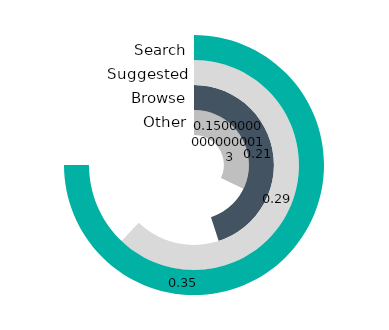
| Category | Series 0 | Series 1 | Series 2 | Series 3 |
|---|---|---|---|---|
| 0 | 0.321 | 0.45 | 0.621 | 0.75 |
| 1 | 0.679 | 0.55 | 0.379 | 0.25 |